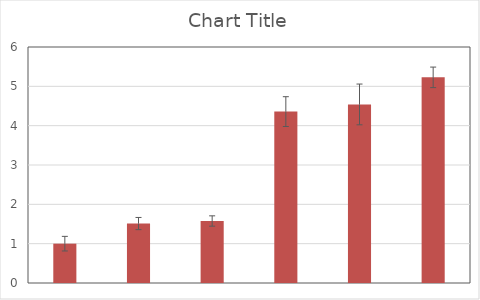
| Category | Series 1 |
|---|---|
| 0 | 1 |
| 1 | 1.511 |
| 2 | 1.576 |
| 3 | 4.358 |
| 4 | 4.54 |
| 5 | 5.228 |